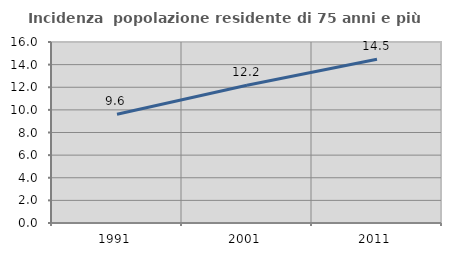
| Category | Incidenza  popolazione residente di 75 anni e più |
|---|---|
| 1991.0 | 9.611 |
| 2001.0 | 12.169 |
| 2011.0 | 14.478 |